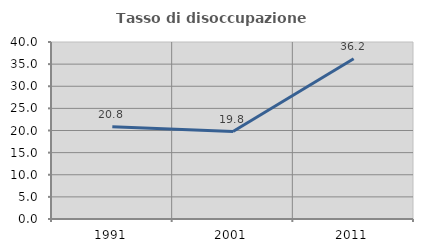
| Category | Tasso di disoccupazione giovanile  |
|---|---|
| 1991.0 | 20.833 |
| 2001.0 | 19.767 |
| 2011.0 | 36.207 |